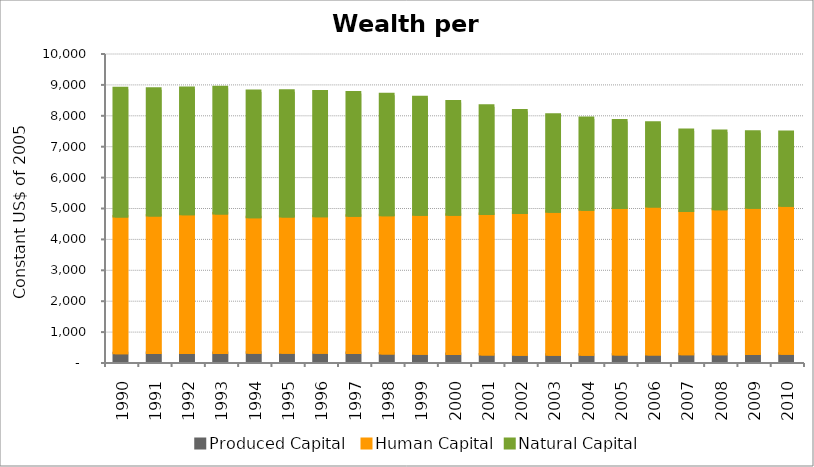
| Category | Produced Capital  | Human Capital | Natural Capital |
|---|---|---|---|
| 1990.0 | 285.711 | 4424.847 | 4147.537 |
| 1991.0 | 288.514 | 4451.12 | 4100.684 |
| 1992.0 | 295.072 | 4486.33 | 4084.164 |
| 1993.0 | 293.89 | 4515.194 | 4085.013 |
| 1994.0 | 298.616 | 4383.06 | 4084.885 |
| 1995.0 | 296.893 | 4413.959 | 4068.97 |
| 1996.0 | 295.806 | 4421.981 | 4035.744 |
| 1997.0 | 287.759 | 4447.098 | 3986.469 |
| 1998.0 | 278.875 | 4471.989 | 3913.163 |
| 1999.0 | 266.568 | 4495.877 | 3808.398 |
| 2000.0 | 255.82 | 4507.2 | 3671.378 |
| 2001.0 | 244.883 | 4543.085 | 3505.148 |
| 2002.0 | 236.835 | 4581.656 | 3320.447 |
| 2003.0 | 234.873 | 4627.389 | 3136.353 |
| 2004.0 | 234.634 | 4689.712 | 2970.377 |
| 2005.0 | 240.357 | 4745.352 | 2830.034 |
| 2006.0 | 245.438 | 4785.808 | 2715.093 |
| 2007.0 | 249.863 | 4640.555 | 2618.369 |
| 2008.0 | 253.683 | 4685.803 | 2534.524 |
| 2009.0 | 258.084 | 4737.095 | 2457.44 |
| 2010.0 | 266.728 | 4793.843 | 2383.26 |